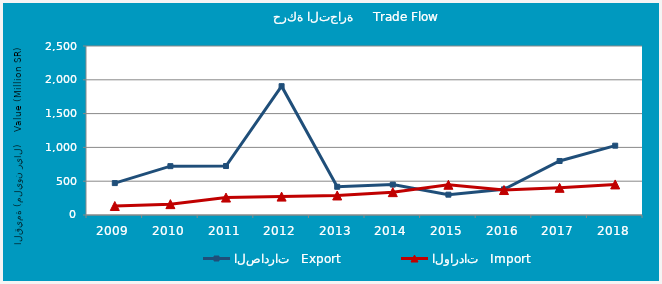
| Category | الصادرات   Export | الواردات   Import |
|---|---|---|
| 2009.0 | 472103569 | 132931954 |
| 2010.0 | 722578304 | 160810446 |
| 2011.0 | 724399999 | 258127494 |
| 2012.0 | 1905732893 | 272074804 |
| 2013.0 | 417641931 | 288727436 |
| 2014.0 | 449869614 | 338146468 |
| 2015.0 | 300764519 | 447392071 |
| 2016.0 | 379541290 | 369224061 |
| 2017.0 | 798861257 | 402092898 |
| 2018.0 | 1025474086 | 452135684 |